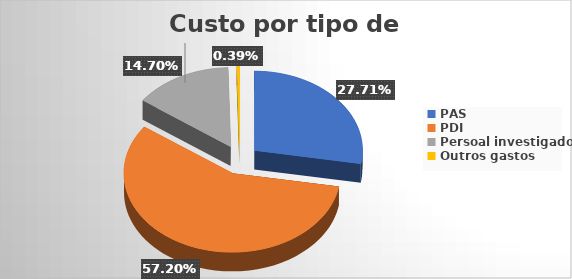
| Category | Custo por tipo de persoal |
|---|---|
| PAS | 0.277 |
| PDI | 0.572 |
| Persoal investigador | 0.147 |
| Outros gastos | 0.004 |